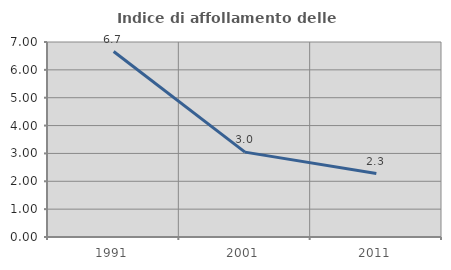
| Category | Indice di affollamento delle abitazioni  |
|---|---|
| 1991.0 | 6.657 |
| 2001.0 | 3.047 |
| 2011.0 | 2.279 |